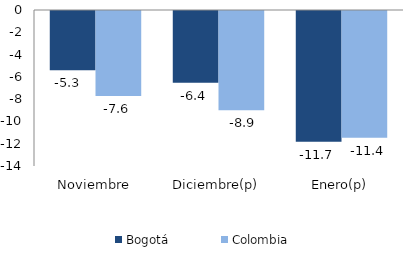
| Category | Bogotá | Colombia |
|---|---|---|
| Noviembre | -5.309 | -7.632 |
| Diciembre(p) | -6.438 | -8.911 |
| Enero(p) | -11.723 | -11.384 |